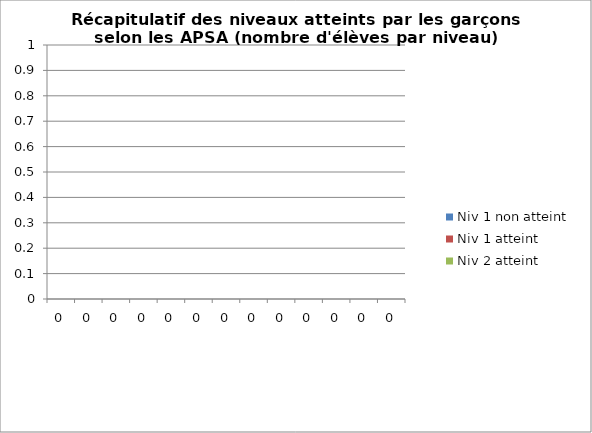
| Category | Niv 1 non atteint | Niv 1 atteint | Niv 2 atteint |
|---|---|---|---|
| 0.0 | 0 | 0 | 0 |
| 0.0 | 0 | 0 | 0 |
| 0.0 | 0 | 0 | 0 |
| 0.0 | 0 | 0 | 0 |
| 0.0 | 0 | 0 | 0 |
| 0.0 | 0 | 0 | 0 |
| 0.0 | 0 | 0 | 0 |
| 0.0 | 0 | 0 | 0 |
| 0.0 | 0 | 0 | 0 |
| 0.0 | 0 | 0 | 0 |
| 0.0 | 0 | 0 | 0 |
| 0.0 | 0 | 0 | 0 |
| 0.0 | 0 | 0 | 0 |